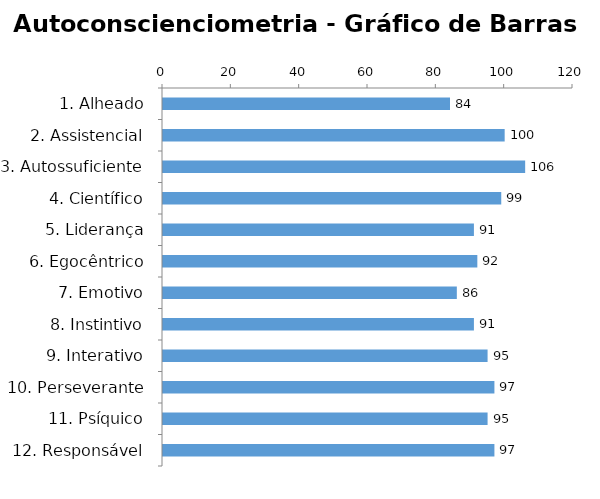
| Category | Series 0 |
|---|---|
| 1. Alheado | 84 |
| 2. Assistencial | 100 |
| 3. Autossuficiente | 106 |
| 4. Científico | 99 |
| 5. Liderança | 91 |
| 6. Egocêntrico | 92 |
| 7. Emotivo | 86 |
| 8. Instintivo | 91 |
| 9. Interativo | 95 |
| 10. Perseverante | 97 |
| 11. Psíquico | 95 |
| 12. Responsável | 97 |